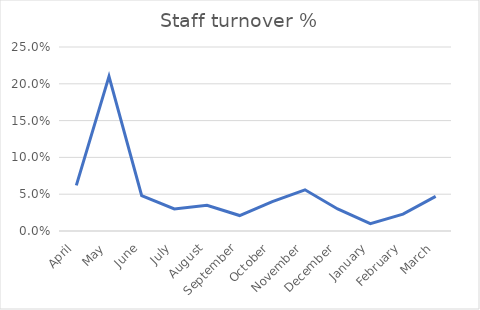
| Category | KPI1 eg staff turnover % |
|---|---|
| April | 0.062 |
| May | 0.21 |
| June | 0.048 |
| July | 0.03 |
| August | 0.035 |
| September | 0.021 |
| October | 0.04 |
| November | 0.056 |
| December | 0.03 |
| January | 0.01 |
| February | 0.023 |
| March | 0.047 |